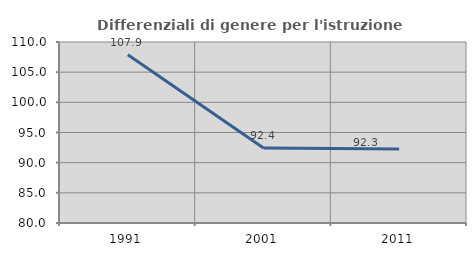
| Category | Differenziali di genere per l'istruzione superiore |
|---|---|
| 1991.0 | 107.886 |
| 2001.0 | 92.431 |
| 2011.0 | 92.253 |